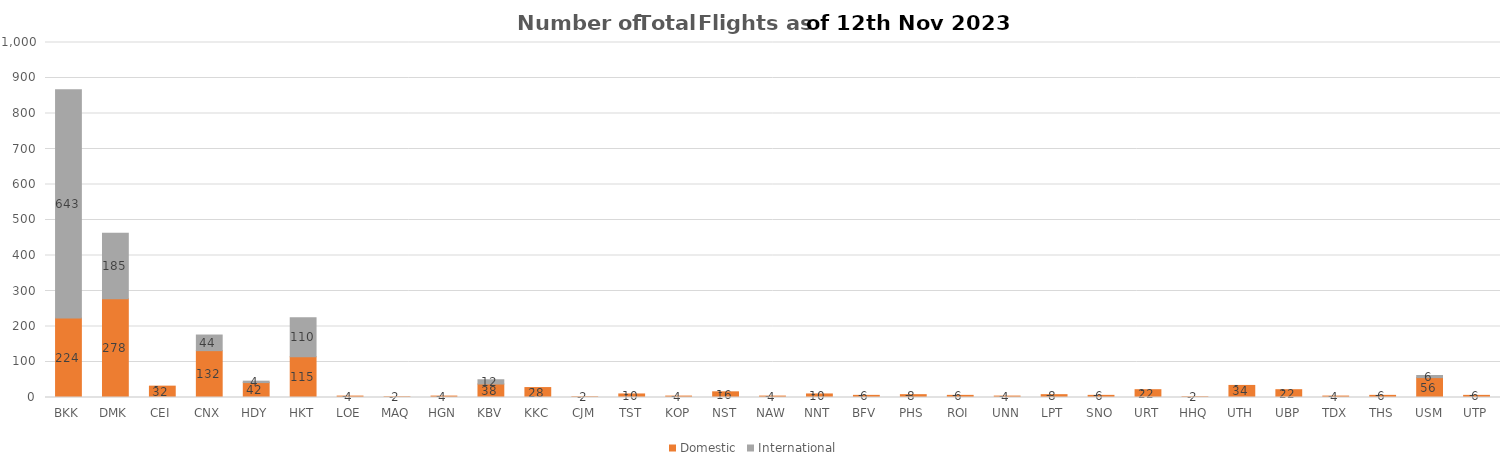
| Category | Domestic | International |
|---|---|---|
| BKK | 224 | 643 |
| DMK | 278 | 185 |
| CEI | 32 | 0 |
| CNX | 132 | 44 |
| HDY | 42 | 4 |
| HKT | 115 | 110 |
| LOE | 4 | 0 |
| MAQ | 2 | 0 |
| HGN | 4 | 0 |
| KBV | 38 | 12 |
| KKC | 28 | 0 |
| CJM | 2 | 0 |
| TST | 10 | 0 |
| KOP | 4 | 0 |
| NST | 16 | 0 |
| NAW | 4 | 0 |
| NNT | 10 | 0 |
| BFV | 6 | 0 |
| PHS | 8 | 0 |
| ROI | 6 | 0 |
| UNN | 4 | 0 |
| LPT | 8 | 0 |
| SNO | 6 | 0 |
| URT | 22 | 0 |
| HHQ | 2 | 0 |
| UTH | 34 | 0 |
| UBP | 22 | 0 |
| TDX | 4 | 0 |
| THS | 6 | 0 |
| USM | 56 | 6 |
| UTP | 6 | 0 |